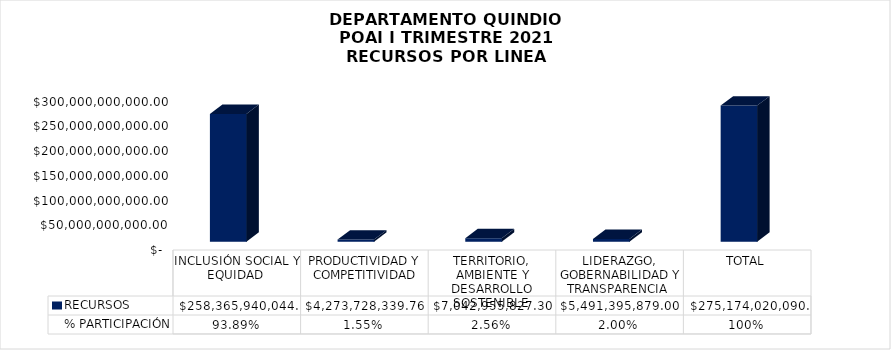
| Category | RECURSOS | % PARTICIPACIÓN |
|---|---|---|
| INCLUSIÓN SOCIAL Y EQUIDAD  | 258365940044.51 | 0.939 |
| PRODUCTIVIDAD Y COMPETITIVIDAD | 4273728339.76 | 0.016 |
| TERRITORIO, AMBIENTE Y DESARROLLO SOSTENIBLE  | 7042955827.3 | 0.026 |
| LIDERAZGO, GOBERNABILIDAD Y TRANSPARENCIA  | 5491395879 | 0.02 |
| TOTAL | 275174020090.57 | 1 |